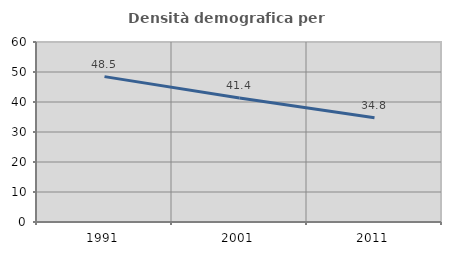
| Category | Densità demografica |
|---|---|
| 1991.0 | 48.455 |
| 2001.0 | 41.357 |
| 2011.0 | 34.755 |